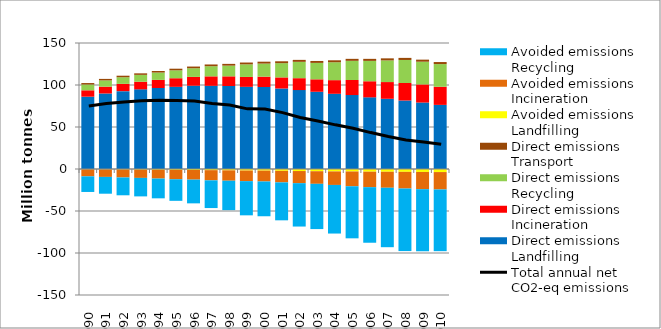
| Category | Direct emissions Landfilling | Direct emissions Incineration | Direct emissions Recycling | Direct emissions Transport | Avoided emissions Landfilling | Avoided emissions Incineration | Avoided emissions Recycling |
|---|---|---|---|---|---|---|---|
| 1990.0 | 86.076 | 7.609 | 6.871 | 1.761 | -0.411 | -8.342 | -18.588 |
| 1991.0 | 89.899 | 8.133 | 7.437 | 1.789 | -0.487 | -8.916 | -20.011 |
| 1992.0 | 92.696 | 8.654 | 7.903 | 1.807 | -0.611 | -9.457 | -21.223 |
| 1993.0 | 94.828 | 9.045 | 8.191 | 1.814 | -0.735 | -9.853 | -22.013 |
| 1994.0 | 96.428 | 9.648 | 8.744 | 1.876 | -0.855 | -10.533 | -23.53 |
| 1995.0 | 97.813 | 10.244 | 9.4 | 1.943 | -0.994 | -11.203 | -25.694 |
| 1996.0 | 99.149 | 10.479 | 10.342 | 1.992 | -1.136 | -11.498 | -28.262 |
| 1997.0 | 99.02 | 11.282 | 12.065 | 2.075 | -1.387 | -12.096 | -33.007 |
| 1998.0 | 98.83 | 11.489 | 12.746 | 2.084 | -1.597 | -12.351 | -34.991 |
| 1999.0 | 97.818 | 11.775 | 14.99 | 2.175 | -1.823 | -12.626 | -40.707 |
| 2000.0 | 97.635 | 12.291 | 15.591 | 2.239 | -1.937 | -12.893 | -41.423 |
| 2001.0 | 95.827 | 13.222 | 16.953 | 2.24 | -2.212 | -13.706 | -45.181 |
| 2002.0 | 93.977 | 14.135 | 19.47 | 2.321 | -2.436 | -14.425 | -51.643 |
| 2003.0 | 91.938 | 14.823 | 19.551 | 2.3 | -2.664 | -14.982 | -53.867 |
| 2004.0 | 89.532 | 16.24 | 21.31 | 2.324 | -2.876 | -16.098 | -57.869 |
| 2005.0 | 88.041 | 17.921 | 22.816 | 2.352 | -2.952 | -17.591 | -61.985 |
| 2006.0 | 85.315 | 19.141 | 24.261 | 2.411 | -3.189 | -18.443 | -66.147 |
| 2007.0 | 83.586 | 19.913 | 25.79 | 2.448 | -3.273 | -19.056 | -70.763 |
| 2008.0 | 81.533 | 20.853 | 27.413 | 2.474 | -3.386 | -19.853 | -74.464 |
| 2009.0 | 79.117 | 21.551 | 27.076 | 2.442 | -3.513 | -20.507 | -73.911 |
| 2010.0 | 76.31 | 21.58 | 27.016 | 2.423 | -3.655 | -20.693 | -73.472 |